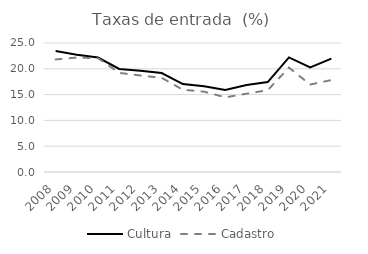
| Category | Cultura | Cadastro |
|---|---|---|
| 2008.0 | 23.446 | 21.814 |
| 2009.0 | 22.704 | 22.176 |
| 2010.0 | 22.18 | 22.053 |
| 2011.0 | 19.965 | 19.21 |
| 2012.0 | 19.605 | 18.7 |
| 2013.0 | 19.184 | 18.254 |
| 2014.0 | 17.051 | 15.936 |
| 2015.0 | 16.622 | 15.566 |
| 2016.0 | 15.886 | 14.47 |
| 2017.0 | 16.853 | 15.171 |
| 2018.0 | 17.434 | 15.868 |
| 2019.0 | 22.209 | 20.225 |
| 2020.0 | 20.262 | 16.949 |
| 2021.0 | 21.982 | 17.822 |